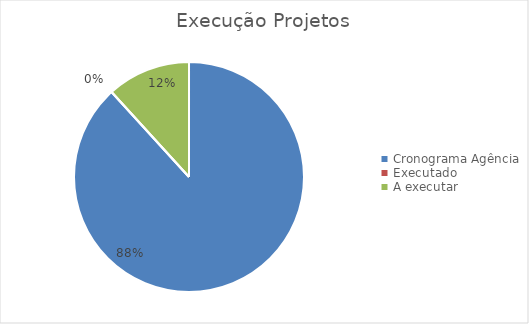
| Category | Execução Projetos |
|---|---|
| Cronograma Agência | 75 |
| Executado | 0 |
| A executar | 10 |